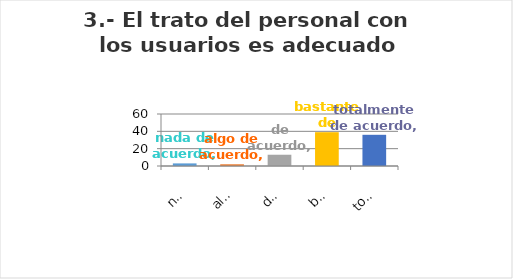
| Category | Series 0 |
|---|---|
| nada de acuerdo | 3 |
| algo de acuerdo | 2 |
| de acuerdo | 13 |
| bastante de acuerdo | 39 |
| totalmente de acuerdo | 36 |